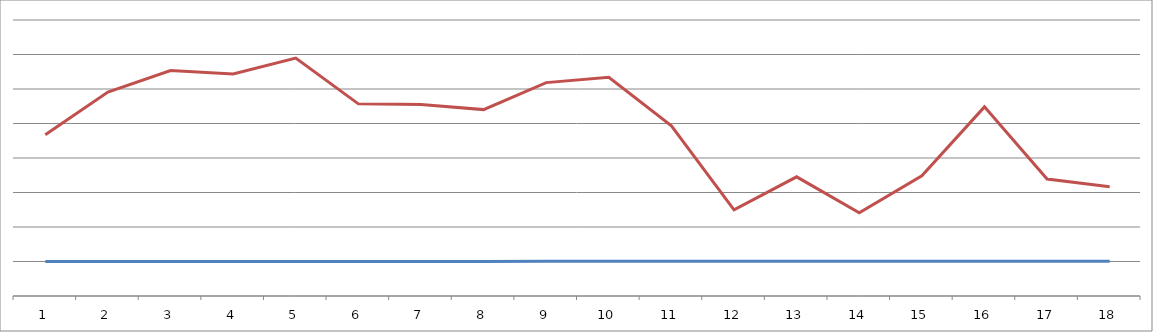
| Category | Series 0 | Series 1 |
|---|---|---|
| 0 | 2000 | 7346 |
| 1 | 2001 | 9822 |
| 2 | 2002 | 11071 |
| 3 | 2003 | 10866 |
| 4 | 2004 | 11792 |
| 5 | 2005 | 9134 |
| 6 | 2006 | 9098 |
| 7 | 2007 | 8798 |
| 8 | 2008 | 10362 |
| 9 | 2009 | 10666.58 |
| 10 | 2010 | 7853.5 |
| 11 | 2011 | 2987.47 |
| 12 | 2012 | 4896 |
| 13 | 2013 | 2805.81 |
| 14 | 2014 | 4951 |
| 15 | 2015 | 8948.82 |
| 16 | 2016 | 4765.37 |
| 17 | 2017 | 4314.02 |